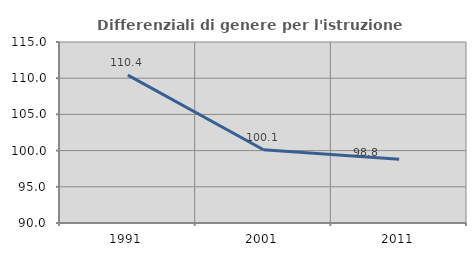
| Category | Differenziali di genere per l'istruzione superiore |
|---|---|
| 1991.0 | 110.422 |
| 2001.0 | 100.118 |
| 2011.0 | 98.818 |